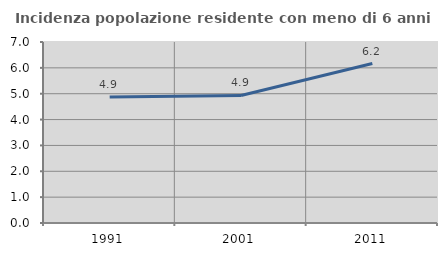
| Category | Incidenza popolazione residente con meno di 6 anni |
|---|---|
| 1991.0 | 4.873 |
| 2001.0 | 4.932 |
| 2011.0 | 6.167 |